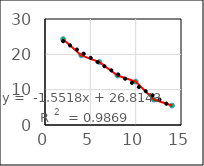
| Category | Series 0 |
|---|---|
| 2.0 | 24.3 |
| 4.0 | 19.7 |
| 6.0 | 17.8 |
| 8.0 | 14 |
| 10.0 | 12.3 |
| 12.0 | 7.2 |
| 14.0 | 5.5 |